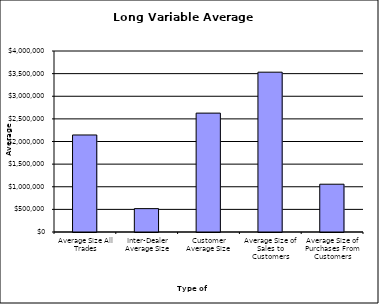
| Category | Security Type |
|---|---|
| Average Size All Trades | 2144250.841 |
| Inter-Dealer Average Size | 516562.092 |
| Customer Average Size | 2627113.427 |
| Average Size of Sales to Customers | 3532039.725 |
| Average Size of Purchases From Customers | 1056094.164 |